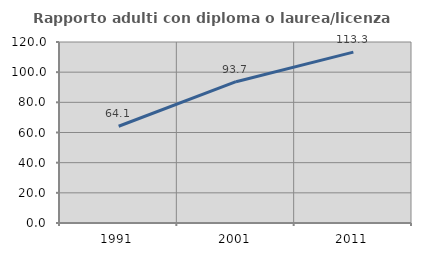
| Category | Rapporto adulti con diploma o laurea/licenza media  |
|---|---|
| 1991.0 | 64.135 |
| 2001.0 | 93.667 |
| 2011.0 | 113.298 |